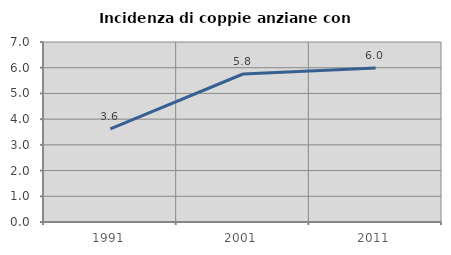
| Category | Incidenza di coppie anziane con figli |
|---|---|
| 1991.0 | 3.62 |
| 2001.0 | 5.755 |
| 2011.0 | 5.989 |